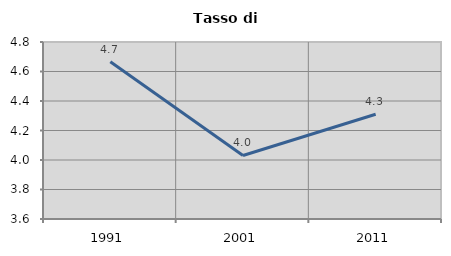
| Category | Tasso di disoccupazione   |
|---|---|
| 1991.0 | 4.667 |
| 2001.0 | 4.031 |
| 2011.0 | 4.31 |